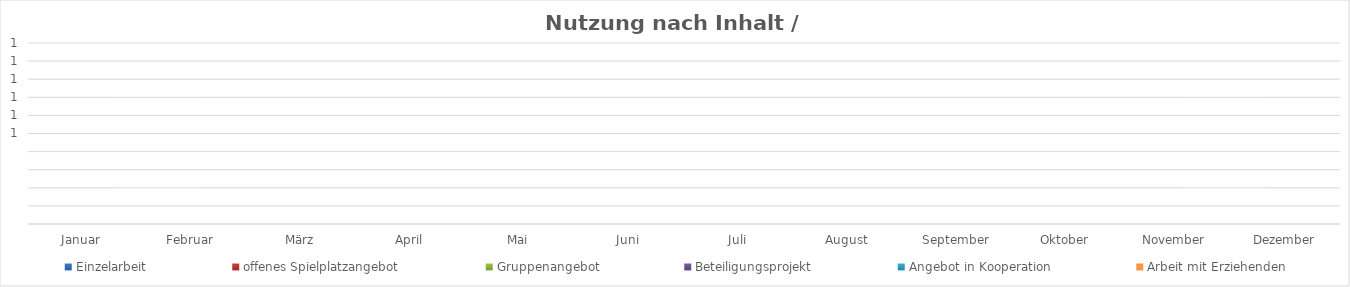
| Category | Einzelarbeit | offenes Spielplatzangebot | Gruppenangebot | Beteiligungsprojekt | Angebot in Kooperation | Arbeit mit Erziehenden |
|---|---|---|---|---|---|---|
| Januar | 0 | 0 | 0 | 0 | 0 | 0 |
| Februar | 0 | 0 | 0 | 0 | 0 | 0 |
| März | 0 | 0 | 0 | 0 | 0 | 0 |
| April | 0 | 0 | 0 | 0 | 0 | 0 |
| Mai | 0 | 0 | 0 | 0 | 0 | 0 |
| Juni | 0 | 0 | 0 | 0 | 0 | 0 |
| Juli | 0 | 0 | 0 | 0 | 0 | 0 |
| August | 0 | 0 | 0 | 0 | 0 | 0 |
| September | 0 | 0 | 0 | 0 | 0 | 0 |
| Oktober | 0 | 0 | 0 | 0 | 0 | 0 |
| November | 0 | 0 | 0 | 0 | 0 | 0 |
| Dezember | 0 | 0 | 0 | 0 | 0 | 0 |